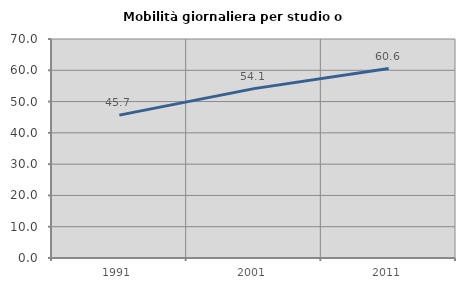
| Category | Mobilità giornaliera per studio o lavoro |
|---|---|
| 1991.0 | 45.67 |
| 2001.0 | 54.133 |
| 2011.0 | 60.553 |